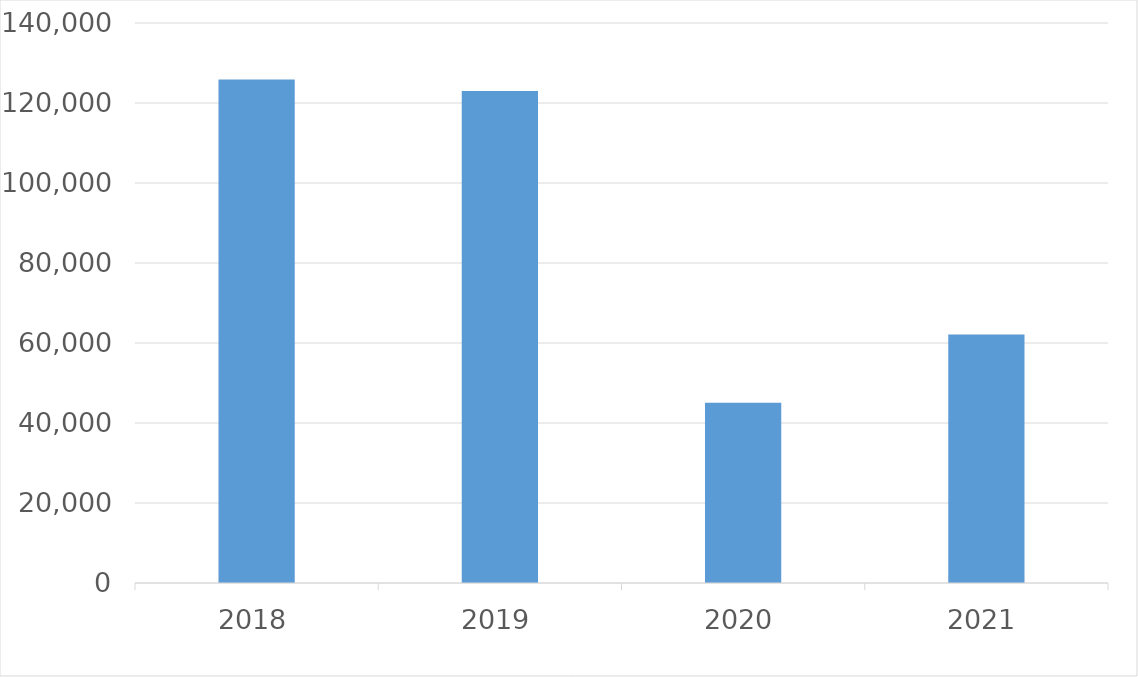
| Category | Series 0 |
|---|---|
| 2018 | 125847 |
| 2019 | 122993 |
| 2020 | 45089 |
| 2021 | 62115 |